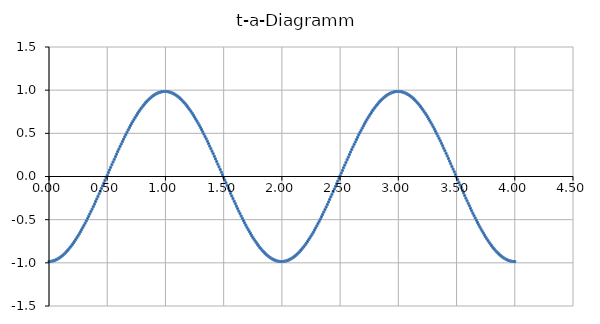
| Category | Series 0 |
|---|---|
| 0.0 | -0.985 |
| 0.01 | -0.984 |
| 0.02 | -0.982 |
| 0.03 | -0.979 |
| 0.04 | -0.976 |
| 0.05 | -0.971 |
| 0.06 | -0.965 |
| 0.07 | -0.958 |
| 0.08 | -0.95 |
| 0.09 | -0.942 |
| 0.1 | -0.932 |
| 0.11 | -0.922 |
| 0.12 | -0.91 |
| 0.13 | -0.898 |
| 0.14 | -0.885 |
| 0.15 | -0.871 |
| 0.16 | -0.856 |
| 0.17 | -0.84 |
| 0.18 | -0.824 |
| 0.19 | -0.806 |
| 0.2 | -0.788 |
| 0.21 | -0.769 |
| 0.22 | -0.75 |
| 0.23 | -0.729 |
| 0.24 | -0.708 |
| 0.25 | -0.686 |
| 0.26 | -0.664 |
| 0.27 | -0.64 |
| 0.28 | -0.617 |
| 0.29 | -0.592 |
| 0.3 | -0.567 |
| 0.31 | -0.542 |
| 0.32 | -0.516 |
| 0.33 | -0.489 |
| 0.34 | -0.462 |
| 0.35 | -0.434 |
| 0.36 | -0.406 |
| 0.37 | -0.378 |
| 0.38 | -0.349 |
| 0.39 | -0.32 |
| 0.4 | -0.291 |
| 0.41 | -0.261 |
| 0.42 | -0.231 |
| 0.43 | -0.201 |
| 0.44 | -0.171 |
| 0.45 | -0.14 |
| 0.46 | -0.109 |
| 0.47 | -0.079 |
| 0.48 | -0.048 |
| 0.49 | -0.017 |
| 0.5 | 0.014 |
| 0.51 | 0.045 |
| 0.52 | 0.076 |
| 0.53 | 0.107 |
| 0.54 | 0.137 |
| 0.55 | 0.168 |
| 0.56 | 0.198 |
| 0.57 | 0.229 |
| 0.58 | 0.259 |
| 0.59 | 0.288 |
| 0.6 | 0.318 |
| 0.61 | 0.347 |
| 0.62 | 0.376 |
| 0.63 | 0.404 |
| 0.64 | 0.432 |
| 0.65 | 0.46 |
| 0.66 | 0.487 |
| 0.67 | 0.513 |
| 0.68 | 0.539 |
| 0.69 | 0.565 |
| 0.7 | 0.59 |
| 0.71 | 0.615 |
| 0.72 | 0.638 |
| 0.73 | 0.662 |
| 0.74 | 0.684 |
| 0.75 | 0.706 |
| 0.76 | 0.727 |
| 0.77 | 0.748 |
| 0.78 | 0.768 |
| 0.790000000000001 | 0.787 |
| 0.8 | 0.805 |
| 0.810000000000001 | 0.822 |
| 0.82 | 0.839 |
| 0.83 | 0.855 |
| 0.84 | 0.87 |
| 0.850000000000001 | 0.884 |
| 0.860000000000001 | 0.897 |
| 0.87 | 0.909 |
| 0.88 | 0.921 |
| 0.890000000000001 | 0.931 |
| 0.900000000000001 | 0.941 |
| 0.910000000000001 | 0.95 |
| 0.92 | 0.958 |
| 0.930000000000001 | 0.964 |
| 0.940000000000001 | 0.97 |
| 0.950000000000001 | 0.975 |
| 0.960000000000001 | 0.979 |
| 0.970000000000001 | 0.982 |
| 0.980000000000001 | 0.984 |
| 0.990000000000001 | 0.985 |
| 1.0 | 0.985 |
| 1.01 | 0.984 |
| 1.02 | 0.983 |
| 1.03 | 0.98 |
| 1.04 | 0.976 |
| 1.05 | 0.971 |
| 1.06 | 0.965 |
| 1.07 | 0.959 |
| 1.08 | 0.951 |
| 1.09 | 0.943 |
| 1.1 | 0.933 |
| 1.11 | 0.923 |
| 1.12 | 0.911 |
| 1.13 | 0.899 |
| 1.14 | 0.886 |
| 1.15 | 0.872 |
| 1.16 | 0.857 |
| 1.17 | 0.842 |
| 1.18 | 0.825 |
| 1.19 | 0.808 |
| 1.2 | 0.79 |
| 1.21 | 0.771 |
| 1.22 | 0.751 |
| 1.23 | 0.731 |
| 1.24 | 0.71 |
| 1.25 | 0.688 |
| 1.26 | 0.666 |
| 1.27 | 0.642 |
| 1.28 | 0.619 |
| 1.29 | 0.594 |
| 1.3 | 0.569 |
| 1.31 | 0.544 |
| 1.32 | 0.518 |
| 1.33 | 0.491 |
| 1.34 | 0.464 |
| 1.35 | 0.437 |
| 1.36 | 0.409 |
| 1.37 | 0.38 |
| 1.38 | 0.352 |
| 1.39 | 0.323 |
| 1.4 | 0.293 |
| 1.41 | 0.264 |
| 1.42 | 0.234 |
| 1.43 | 0.203 |
| 1.44 | 0.173 |
| 1.45 | 0.143 |
| 1.46 | 0.112 |
| 1.47 | 0.081 |
| 1.48 | 0.05 |
| 1.49 | 0.019 |
| 1.5 | -0.012 |
| 1.51 | -0.042 |
| 1.52 | -0.073 |
| 1.53 | -0.104 |
| 1.54 | -0.135 |
| 1.55 | -0.165 |
| 1.56 | -0.196 |
| 1.57 | -0.226 |
| 1.58 | -0.256 |
| 1.59 | -0.286 |
| 1.6 | -0.315 |
| 1.61 | -0.344 |
| 1.62 | -0.373 |
| 1.63 | -0.402 |
| 1.64 | -0.43 |
| 1.65 | -0.457 |
| 1.66 | -0.484 |
| 1.67 | -0.511 |
| 1.68 | -0.537 |
| 1.69 | -0.563 |
| 1.7 | -0.588 |
| 1.71 | -0.613 |
| 1.72 | -0.637 |
| 1.73 | -0.66 |
| 1.74 | -0.682 |
| 1.75 | -0.704 |
| 1.76 | -0.726 |
| 1.77 | -0.746 |
| 1.78 | -0.766 |
| 1.79 | -0.785 |
| 1.8 | -0.803 |
| 1.81 | -0.821 |
| 1.82 | -0.838 |
| 1.83 | -0.854 |
| 1.84 | -0.869 |
| 1.85 | -0.883 |
| 1.86 | -0.896 |
| 1.87 | -0.908 |
| 1.88 | -0.92 |
| 1.89 | -0.931 |
| 1.9 | -0.94 |
| 1.91 | -0.949 |
| 1.92 | -0.957 |
| 1.93 | -0.964 |
| 1.94 | -0.97 |
| 1.95 | -0.975 |
| 1.96 | -0.979 |
| 1.97 | -0.982 |
| 1.98 | -0.984 |
| 1.99 | -0.985 |
| 2.0 | -0.985 |
| 2.01 | -0.984 |
| 2.02 | -0.983 |
| 2.03 | -0.98 |
| 2.04 | -0.976 |
| 2.05 | -0.972 |
| 2.06 | -0.966 |
| 2.07 | -0.959 |
| 2.08 | -0.952 |
| 2.09 | -0.943 |
| 2.1 | -0.934 |
| 2.11 | -0.924 |
| 2.12 | -0.912 |
| 2.13 | -0.9 |
| 2.14 | -0.887 |
| 2.15 | -0.873 |
| 2.16 | -0.859 |
| 2.17 | -0.843 |
| 2.18 | -0.827 |
| 2.19 | -0.809 |
| 2.2 | -0.791 |
| 2.21 | -0.773 |
| 2.22 | -0.753 |
| 2.23 | -0.733 |
| 2.24 | -0.712 |
| 2.25 | -0.69 |
| 2.26 | -0.667 |
| 2.27 | -0.644 |
| 2.28 | -0.621 |
| 2.29 | -0.596 |
| 2.29999999999999 | -0.571 |
| 2.30999999999999 | -0.546 |
| 2.31999999999999 | -0.52 |
| 2.32999999999999 | -0.493 |
| 2.33999999999999 | -0.466 |
| 2.34999999999999 | -0.439 |
| 2.35999999999999 | -0.411 |
| 2.36999999999999 | -0.383 |
| 2.37999999999999 | -0.354 |
| 2.38999999999999 | -0.325 |
| 2.39999999999999 | -0.296 |
| 2.40999999999999 | -0.266 |
| 2.41999999999999 | -0.236 |
| 2.42999999999999 | -0.206 |
| 2.43999999999999 | -0.176 |
| 2.44999999999999 | -0.145 |
| 2.45999999999999 | -0.114 |
| 2.46999999999999 | -0.084 |
| 2.47999999999999 | -0.053 |
| 2.48999999999999 | -0.022 |
| 2.49999999999999 | 0.009 |
| 2.50999999999999 | 0.04 |
| 2.51999999999999 | 0.071 |
| 2.52999999999999 | 0.102 |
| 2.53999999999999 | 0.132 |
| 2.54999999999999 | 0.163 |
| 2.55999999999999 | 0.193 |
| 2.56999999999999 | 0.224 |
| 2.57999999999999 | 0.254 |
| 2.58999999999999 | 0.283 |
| 2.59999999999999 | 0.313 |
| 2.60999999999999 | 0.342 |
| 2.61999999999999 | 0.371 |
| 2.62999999999999 | 0.399 |
| 2.63999999999999 | 0.427 |
| 2.64999999999999 | 0.455 |
| 2.65999999999999 | 0.482 |
| 2.66999999999999 | 0.509 |
| 2.67999999999999 | 0.535 |
| 2.68999999999999 | 0.561 |
| 2.69999999999999 | 0.586 |
| 2.70999999999999 | 0.611 |
| 2.71999999999999 | 0.635 |
| 2.72999999999999 | 0.658 |
| 2.73999999999999 | 0.681 |
| 2.74999999999999 | 0.703 |
| 2.75999999999999 | 0.724 |
| 2.76999999999998 | 0.745 |
| 2.77999999999998 | 0.764 |
| 2.78999999999998 | 0.784 |
| 2.79999999999998 | 0.802 |
| 2.80999999999998 | 0.82 |
| 2.81999999999998 | 0.836 |
| 2.82999999999998 | 0.852 |
| 2.83999999999998 | 0.867 |
| 2.84999999999998 | 0.882 |
| 2.85999999999998 | 0.895 |
| 2.86999999999998 | 0.907 |
| 2.87999999999998 | 0.919 |
| 2.88999999999998 | 0.93 |
| 2.89999999999998 | 0.94 |
| 2.90999999999998 | 0.948 |
| 2.91999999999998 | 0.956 |
| 2.92999999999998 | 0.963 |
| 2.93999999999998 | 0.969 |
| 2.94999999999998 | 0.974 |
| 2.95999999999998 | 0.979 |
| 2.96999999999998 | 0.982 |
| 2.97999999999998 | 0.984 |
| 2.98999999999998 | 0.985 |
| 2.99999999999998 | 0.985 |
| 3.00999999999998 | 0.985 |
| 3.01999999999998 | 0.983 |
| 3.02999999999998 | 0.98 |
| 3.03999999999998 | 0.977 |
| 3.04999999999998 | 0.972 |
| 3.05999999999998 | 0.966 |
| 3.06999999999998 | 0.96 |
| 3.07999999999998 | 0.953 |
| 3.08999999999998 | 0.944 |
| 3.09999999999998 | 0.935 |
| 3.10999999999998 | 0.925 |
| 3.11999999999998 | 0.913 |
| 3.12999999999998 | 0.901 |
| 3.13999999999998 | 0.888 |
| 3.14999999999998 | 0.875 |
| 3.15999999999998 | 0.86 |
| 3.16999999999998 | 0.844 |
| 3.17999999999998 | 0.828 |
| 3.18999999999998 | 0.811 |
| 3.19999999999998 | 0.793 |
| 3.20999999999998 | 0.774 |
| 3.21999999999998 | 0.755 |
| 3.22999999999997 | 0.734 |
| 3.23999999999997 | 0.713 |
| 3.24999999999997 | 0.692 |
| 3.25999999999997 | 0.669 |
| 3.26999999999997 | 0.646 |
| 3.27999999999997 | 0.623 |
| 3.28999999999997 | 0.598 |
| 3.29999999999997 | 0.574 |
| 3.30999999999997 | 0.548 |
| 3.31999999999997 | 0.522 |
| 3.32999999999997 | 0.496 |
| 3.33999999999997 | 0.469 |
| 3.34999999999997 | 0.441 |
| 3.35999999999997 | 0.413 |
| 3.36999999999997 | 0.385 |
| 3.37999999999997 | 0.357 |
| 3.38999999999997 | 0.328 |
| 3.39999999999997 | 0.298 |
| 3.40999999999997 | 0.269 |
| 3.41999999999997 | 0.239 |
| 3.42999999999997 | 0.209 |
| 3.43999999999997 | 0.178 |
| 3.44999999999997 | 0.148 |
| 3.45999999999997 | 0.117 |
| 3.46999999999997 | 0.086 |
| 3.47999999999997 | 0.055 |
| 3.48999999999997 | 0.025 |
| 3.49999999999997 | -0.006 |
| 3.50999999999997 | -0.037 |
| 3.51999999999997 | -0.068 |
| 3.52999999999997 | -0.099 |
| 3.53999999999997 | -0.13 |
| 3.54999999999997 | -0.16 |
| 3.55999999999997 | -0.191 |
| 3.56999999999997 | -0.221 |
| 3.57999999999997 | -0.251 |
| 3.58999999999997 | -0.281 |
| 3.59999999999997 | -0.31 |
| 3.60999999999997 | -0.339 |
| 3.61999999999997 | -0.368 |
| 3.62999999999997 | -0.397 |
| 3.63999999999997 | -0.425 |
| 3.64999999999997 | -0.453 |
| 3.65999999999997 | -0.48 |
| 3.66999999999997 | -0.507 |
| 3.67999999999997 | -0.533 |
| 3.68999999999997 | -0.559 |
| 3.69999999999996 | -0.584 |
| 3.70999999999996 | -0.609 |
| 3.71999999999996 | -0.633 |
| 3.72999999999996 | -0.656 |
| 3.73999999999996 | -0.679 |
| 3.74999999999996 | -0.701 |
| 3.75999999999996 | -0.722 |
| 3.76999999999996 | -0.743 |
| 3.77999999999996 | -0.763 |
| 3.78999999999996 | -0.782 |
| 3.79999999999996 | -0.8 |
| 3.80999999999996 | -0.818 |
| 3.81999999999996 | -0.835 |
| 3.82999999999996 | -0.851 |
| 3.83999999999996 | -0.866 |
| 3.84999999999996 | -0.88 |
| 3.85999999999996 | -0.894 |
| 3.86999999999996 | -0.906 |
| 3.87999999999996 | -0.918 |
| 3.88999999999996 | -0.929 |
| 3.89999999999996 | -0.939 |
| 3.90999999999996 | -0.948 |
| 3.91999999999996 | -0.956 |
| 3.92999999999996 | -0.963 |
| 3.93999999999996 | -0.969 |
| 3.94999999999996 | -0.974 |
| 3.95999999999996 | -0.978 |
| 3.96999999999996 | -0.981 |
| 3.97999999999996 | -0.984 |
| 3.98999999999996 | -0.985 |
| 3.99999999999996 | -0.985 |